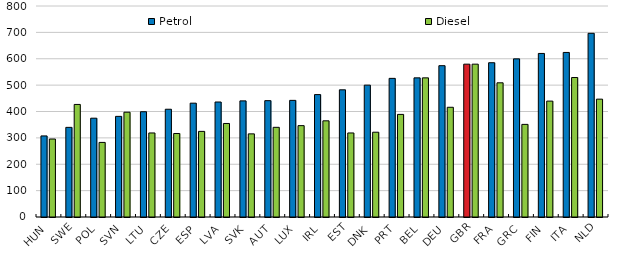
| Category | Petrol | Diesel |
|---|---|---|
| HUN | 307.362 | 295.672 |
| SWE | 339.825 | 426.741 |
| POL | 374.586 | 282.784 |
| SVN | 381.576 | 397.379 |
| LTU | 399.143 | 318.629 |
| CZE | 408.568 | 316.609 |
| ESP | 431.623 | 324.625 |
| LVA | 435.974 | 354.603 |
| SVK | 440.256 | 315.203 |
| AUT | 441.113 | 340.042 |
| LUX | 442.239 | 346.398 |
| IRL | 464.102 | 364.642 |
| EST | 482.226 | 318.629 |
| DNK | 499.962 | 321.453 |
| PRT | 525.601 | 388.993 |
| BEL | 527.499 | 527.51 |
| DEU | 573.704 | 416.017 |
| GBR | 579.5 | 579.5 |
| FRA | 584.924 | 508.779 |
| GRC | 599.571 | 351.177 |
| FIN | 620.128 | 439.4 |
| ITA | 623.896 | 528.822 |
| NLD | 696.479 | 446.835 |